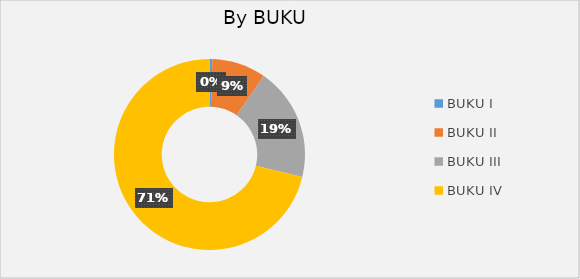
| Category | H. Deposits by BUKU |
|---|---|
| BUKU I  | 1651448 |
| BUKU II  | 31101930 |
| BUKU III  | 65194386 |
| BUKU IV  | 242259203 |